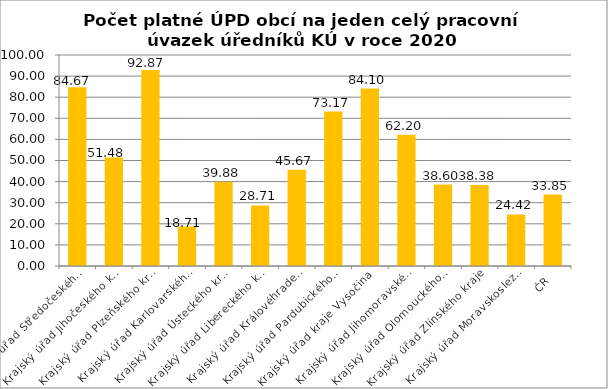
| Category | Počet platné ÚPD obcí na jeden celý pracovní úvazek úředníků KÚ |
|---|---|
| Krajský úřad Středočeského kraje | 84.67 |
| Krajský úřad Jihočeského kraje | 51.48 |
| Krajský úřad Plzeňského kraje | 92.87 |
| Krajský úřad Karlovarského kraje | 18.71 |
| Krajský úřad Ústeckého kraje | 39.88 |
| Krajský úřad Libereckého kraje | 28.71 |
| Krajský úřad Královéhradeckého kraje | 45.67 |
| Krajský úřad Pardubického kraje | 73.17 |
| Krajský úřad kraje Vysočina | 84.1 |
| Krajský úřad Jihomoravského kraje | 62.2 |
| Krajský úřad Olomouckého kraje | 38.6 |
| Krajský úřad Zlínského kraje | 38.38 |
| Krajský úřad Moravskoslezského kraje | 24.42 |
| ČR | 33.85 |